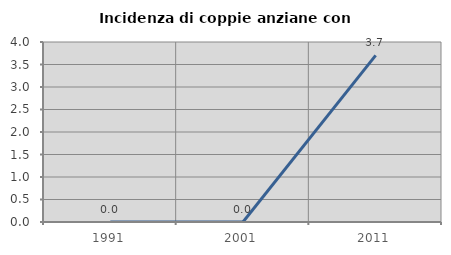
| Category | Incidenza di coppie anziane con figli |
|---|---|
| 1991.0 | 0 |
| 2001.0 | 0 |
| 2011.0 | 3.704 |